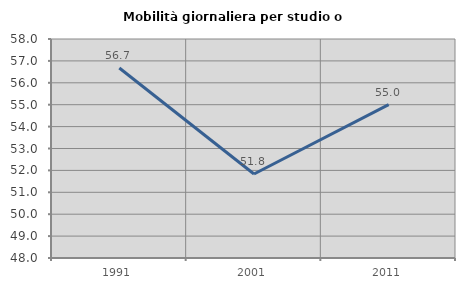
| Category | Mobilità giornaliera per studio o lavoro |
|---|---|
| 1991.0 | 56.676 |
| 2001.0 | 51.837 |
| 2011.0 | 55.002 |